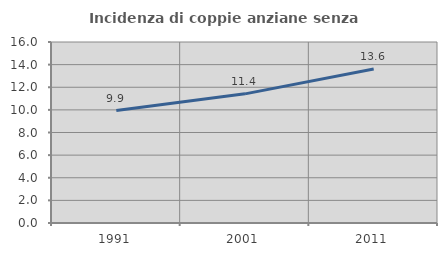
| Category | Incidenza di coppie anziane senza figli  |
|---|---|
| 1991.0 | 9.942 |
| 2001.0 | 11.416 |
| 2011.0 | 13.605 |